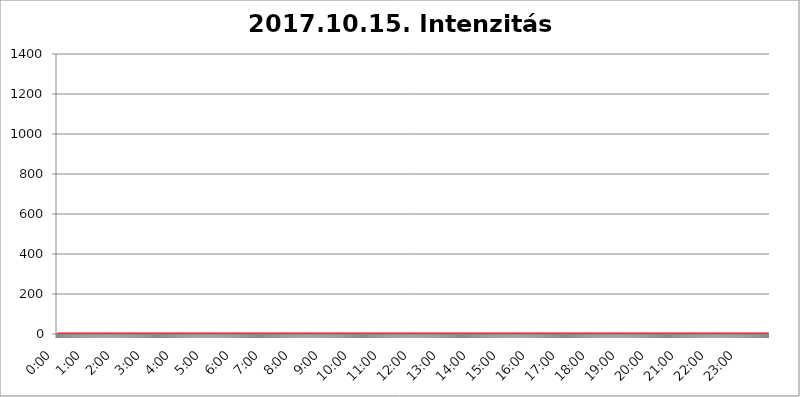
| Category | 2017.10.15. Intenzitás [W/m^2] |
|---|---|
| 0.0 | 0 |
| 0.0006944444444444445 | 0 |
| 0.001388888888888889 | 0 |
| 0.0020833333333333333 | 0 |
| 0.002777777777777778 | 0 |
| 0.003472222222222222 | 0 |
| 0.004166666666666667 | 0 |
| 0.004861111111111111 | 0 |
| 0.005555555555555556 | 0 |
| 0.0062499999999999995 | 0 |
| 0.006944444444444444 | 0 |
| 0.007638888888888889 | 0 |
| 0.008333333333333333 | 0 |
| 0.009027777777777779 | 0 |
| 0.009722222222222222 | 0 |
| 0.010416666666666666 | 0 |
| 0.011111111111111112 | 0 |
| 0.011805555555555555 | 0 |
| 0.012499999999999999 | 0 |
| 0.013194444444444444 | 0 |
| 0.013888888888888888 | 0 |
| 0.014583333333333332 | 0 |
| 0.015277777777777777 | 0 |
| 0.015972222222222224 | 0 |
| 0.016666666666666666 | 0 |
| 0.017361111111111112 | 0 |
| 0.018055555555555557 | 0 |
| 0.01875 | 0 |
| 0.019444444444444445 | 0 |
| 0.02013888888888889 | 0 |
| 0.020833333333333332 | 0 |
| 0.02152777777777778 | 0 |
| 0.022222222222222223 | 0 |
| 0.02291666666666667 | 0 |
| 0.02361111111111111 | 0 |
| 0.024305555555555556 | 0 |
| 0.024999999999999998 | 0 |
| 0.025694444444444447 | 0 |
| 0.02638888888888889 | 0 |
| 0.027083333333333334 | 0 |
| 0.027777777777777776 | 0 |
| 0.02847222222222222 | 0 |
| 0.029166666666666664 | 0 |
| 0.029861111111111113 | 0 |
| 0.030555555555555555 | 0 |
| 0.03125 | 0 |
| 0.03194444444444445 | 0 |
| 0.03263888888888889 | 0 |
| 0.03333333333333333 | 0 |
| 0.034027777777777775 | 0 |
| 0.034722222222222224 | 0 |
| 0.035416666666666666 | 0 |
| 0.036111111111111115 | 0 |
| 0.03680555555555556 | 0 |
| 0.0375 | 0 |
| 0.03819444444444444 | 0 |
| 0.03888888888888889 | 0 |
| 0.03958333333333333 | 0 |
| 0.04027777777777778 | 0 |
| 0.04097222222222222 | 0 |
| 0.041666666666666664 | 0 |
| 0.042361111111111106 | 0 |
| 0.04305555555555556 | 0 |
| 0.043750000000000004 | 0 |
| 0.044444444444444446 | 0 |
| 0.04513888888888889 | 0 |
| 0.04583333333333334 | 0 |
| 0.04652777777777778 | 0 |
| 0.04722222222222222 | 0 |
| 0.04791666666666666 | 0 |
| 0.04861111111111111 | 0 |
| 0.049305555555555554 | 0 |
| 0.049999999999999996 | 0 |
| 0.05069444444444445 | 0 |
| 0.051388888888888894 | 0 |
| 0.052083333333333336 | 0 |
| 0.05277777777777778 | 0 |
| 0.05347222222222222 | 0 |
| 0.05416666666666667 | 0 |
| 0.05486111111111111 | 0 |
| 0.05555555555555555 | 0 |
| 0.05625 | 0 |
| 0.05694444444444444 | 0 |
| 0.057638888888888885 | 0 |
| 0.05833333333333333 | 0 |
| 0.05902777777777778 | 0 |
| 0.059722222222222225 | 0 |
| 0.06041666666666667 | 0 |
| 0.061111111111111116 | 0 |
| 0.06180555555555556 | 0 |
| 0.0625 | 0 |
| 0.06319444444444444 | 0 |
| 0.06388888888888888 | 0 |
| 0.06458333333333334 | 0 |
| 0.06527777777777778 | 0 |
| 0.06597222222222222 | 0 |
| 0.06666666666666667 | 0 |
| 0.06736111111111111 | 0 |
| 0.06805555555555555 | 0 |
| 0.06874999999999999 | 0 |
| 0.06944444444444443 | 0 |
| 0.07013888888888889 | 0 |
| 0.07083333333333333 | 0 |
| 0.07152777777777779 | 0 |
| 0.07222222222222223 | 0 |
| 0.07291666666666667 | 0 |
| 0.07361111111111111 | 0 |
| 0.07430555555555556 | 0 |
| 0.075 | 0 |
| 0.07569444444444444 | 0 |
| 0.0763888888888889 | 0 |
| 0.07708333333333334 | 0 |
| 0.07777777777777778 | 0 |
| 0.07847222222222222 | 0 |
| 0.07916666666666666 | 0 |
| 0.0798611111111111 | 0 |
| 0.08055555555555556 | 0 |
| 0.08125 | 0 |
| 0.08194444444444444 | 0 |
| 0.08263888888888889 | 0 |
| 0.08333333333333333 | 0 |
| 0.08402777777777777 | 0 |
| 0.08472222222222221 | 0 |
| 0.08541666666666665 | 0 |
| 0.08611111111111112 | 0 |
| 0.08680555555555557 | 0 |
| 0.08750000000000001 | 0 |
| 0.08819444444444445 | 0 |
| 0.08888888888888889 | 0 |
| 0.08958333333333333 | 0 |
| 0.09027777777777778 | 0 |
| 0.09097222222222222 | 0 |
| 0.09166666666666667 | 0 |
| 0.09236111111111112 | 0 |
| 0.09305555555555556 | 0 |
| 0.09375 | 0 |
| 0.09444444444444444 | 0 |
| 0.09513888888888888 | 0 |
| 0.09583333333333333 | 0 |
| 0.09652777777777777 | 0 |
| 0.09722222222222222 | 0 |
| 0.09791666666666667 | 0 |
| 0.09861111111111111 | 0 |
| 0.09930555555555555 | 0 |
| 0.09999999999999999 | 0 |
| 0.10069444444444443 | 0 |
| 0.1013888888888889 | 0 |
| 0.10208333333333335 | 0 |
| 0.10277777777777779 | 0 |
| 0.10347222222222223 | 0 |
| 0.10416666666666667 | 0 |
| 0.10486111111111111 | 0 |
| 0.10555555555555556 | 0 |
| 0.10625 | 0 |
| 0.10694444444444444 | 0 |
| 0.1076388888888889 | 0 |
| 0.10833333333333334 | 0 |
| 0.10902777777777778 | 0 |
| 0.10972222222222222 | 0 |
| 0.1111111111111111 | 0 |
| 0.11180555555555556 | 0 |
| 0.11180555555555556 | 0 |
| 0.1125 | 0 |
| 0.11319444444444444 | 0 |
| 0.11388888888888889 | 0 |
| 0.11458333333333333 | 0 |
| 0.11527777777777777 | 0 |
| 0.11597222222222221 | 0 |
| 0.11666666666666665 | 0 |
| 0.1173611111111111 | 0 |
| 0.11805555555555557 | 0 |
| 0.11944444444444445 | 0 |
| 0.12013888888888889 | 0 |
| 0.12083333333333333 | 0 |
| 0.12152777777777778 | 0 |
| 0.12222222222222223 | 0 |
| 0.12291666666666667 | 0 |
| 0.12291666666666667 | 0 |
| 0.12361111111111112 | 0 |
| 0.12430555555555556 | 0 |
| 0.125 | 0 |
| 0.12569444444444444 | 0 |
| 0.12638888888888888 | 0 |
| 0.12708333333333333 | 0 |
| 0.16875 | 0 |
| 0.12847222222222224 | 0 |
| 0.12916666666666668 | 0 |
| 0.12986111111111112 | 0 |
| 0.13055555555555556 | 0 |
| 0.13125 | 0 |
| 0.13194444444444445 | 0 |
| 0.1326388888888889 | 0 |
| 0.13333333333333333 | 0 |
| 0.13402777777777777 | 0 |
| 0.13402777777777777 | 0 |
| 0.13472222222222222 | 0 |
| 0.13541666666666666 | 0 |
| 0.1361111111111111 | 0 |
| 0.13749999999999998 | 0 |
| 0.13819444444444443 | 0 |
| 0.1388888888888889 | 0 |
| 0.13958333333333334 | 0 |
| 0.14027777777777778 | 0 |
| 0.14097222222222222 | 0 |
| 0.14166666666666666 | 0 |
| 0.1423611111111111 | 0 |
| 0.14305555555555557 | 0 |
| 0.14375000000000002 | 0 |
| 0.14444444444444446 | 0 |
| 0.1451388888888889 | 0 |
| 0.1451388888888889 | 0 |
| 0.14652777777777778 | 0 |
| 0.14722222222222223 | 0 |
| 0.14791666666666667 | 0 |
| 0.1486111111111111 | 0 |
| 0.14930555555555555 | 0 |
| 0.15 | 0 |
| 0.15069444444444444 | 0 |
| 0.15138888888888888 | 0 |
| 0.15208333333333332 | 0 |
| 0.15277777777777776 | 0 |
| 0.15347222222222223 | 0 |
| 0.15416666666666667 | 0 |
| 0.15486111111111112 | 0 |
| 0.15555555555555556 | 0 |
| 0.15625 | 0 |
| 0.15694444444444444 | 0 |
| 0.15763888888888888 | 0 |
| 0.15833333333333333 | 0 |
| 0.15902777777777777 | 0 |
| 0.15972222222222224 | 0 |
| 0.16041666666666668 | 0 |
| 0.16111111111111112 | 0 |
| 0.16180555555555556 | 0 |
| 0.1625 | 0 |
| 0.16319444444444445 | 0 |
| 0.1638888888888889 | 0 |
| 0.16458333333333333 | 0 |
| 0.16527777777777777 | 0 |
| 0.16597222222222222 | 0 |
| 0.16666666666666666 | 0 |
| 0.1673611111111111 | 0 |
| 0.16805555555555554 | 0 |
| 0.16874999999999998 | 0 |
| 0.16944444444444443 | 0 |
| 0.17013888888888887 | 0 |
| 0.1708333333333333 | 0 |
| 0.17152777777777775 | 0 |
| 0.17222222222222225 | 0 |
| 0.1729166666666667 | 0 |
| 0.17361111111111113 | 0 |
| 0.17430555555555557 | 0 |
| 0.17500000000000002 | 0 |
| 0.17569444444444446 | 0 |
| 0.1763888888888889 | 0 |
| 0.17708333333333334 | 0 |
| 0.17777777777777778 | 0 |
| 0.17847222222222223 | 0 |
| 0.17916666666666667 | 0 |
| 0.1798611111111111 | 0 |
| 0.18055555555555555 | 0 |
| 0.18125 | 0 |
| 0.18194444444444444 | 0 |
| 0.1826388888888889 | 0 |
| 0.18333333333333335 | 0 |
| 0.1840277777777778 | 0 |
| 0.18472222222222223 | 0 |
| 0.18541666666666667 | 0 |
| 0.18611111111111112 | 0 |
| 0.18680555555555556 | 0 |
| 0.1875 | 0 |
| 0.18819444444444444 | 0 |
| 0.18888888888888888 | 0 |
| 0.18958333333333333 | 0 |
| 0.19027777777777777 | 0 |
| 0.1909722222222222 | 0 |
| 0.19166666666666665 | 0 |
| 0.19236111111111112 | 0 |
| 0.19305555555555554 | 0 |
| 0.19375 | 0 |
| 0.19444444444444445 | 0 |
| 0.1951388888888889 | 0 |
| 0.19583333333333333 | 0 |
| 0.19652777777777777 | 0 |
| 0.19722222222222222 | 0 |
| 0.19791666666666666 | 0 |
| 0.1986111111111111 | 0 |
| 0.19930555555555554 | 0 |
| 0.19999999999999998 | 0 |
| 0.20069444444444443 | 0 |
| 0.20138888888888887 | 0 |
| 0.2020833333333333 | 0 |
| 0.2027777777777778 | 0 |
| 0.2034722222222222 | 0 |
| 0.2041666666666667 | 0 |
| 0.20486111111111113 | 0 |
| 0.20555555555555557 | 0 |
| 0.20625000000000002 | 0 |
| 0.20694444444444446 | 0 |
| 0.2076388888888889 | 0 |
| 0.20833333333333334 | 0 |
| 0.20902777777777778 | 0 |
| 0.20972222222222223 | 0 |
| 0.21041666666666667 | 0 |
| 0.2111111111111111 | 0 |
| 0.21180555555555555 | 0 |
| 0.2125 | 0 |
| 0.21319444444444444 | 0 |
| 0.2138888888888889 | 0 |
| 0.21458333333333335 | 0 |
| 0.2152777777777778 | 0 |
| 0.21597222222222223 | 0 |
| 0.21666666666666667 | 0 |
| 0.21736111111111112 | 0 |
| 0.21805555555555556 | 0 |
| 0.21875 | 0 |
| 0.21944444444444444 | 0 |
| 0.22013888888888888 | 0 |
| 0.22083333333333333 | 0 |
| 0.22152777777777777 | 0 |
| 0.2222222222222222 | 0 |
| 0.22291666666666665 | 0 |
| 0.2236111111111111 | 0 |
| 0.22430555555555556 | 0 |
| 0.225 | 0 |
| 0.22569444444444445 | 0 |
| 0.2263888888888889 | 0 |
| 0.22708333333333333 | 0 |
| 0.22777777777777777 | 0 |
| 0.22847222222222222 | 0 |
| 0.22916666666666666 | 0 |
| 0.2298611111111111 | 0 |
| 0.23055555555555554 | 0 |
| 0.23124999999999998 | 0 |
| 0.23194444444444443 | 0 |
| 0.23263888888888887 | 0 |
| 0.2333333333333333 | 0 |
| 0.2340277777777778 | 0 |
| 0.2347222222222222 | 0 |
| 0.2354166666666667 | 0 |
| 0.23611111111111113 | 0 |
| 0.23680555555555557 | 0 |
| 0.23750000000000002 | 0 |
| 0.23819444444444446 | 0 |
| 0.2388888888888889 | 0 |
| 0.23958333333333334 | 0 |
| 0.24027777777777778 | 0 |
| 0.24097222222222223 | 0 |
| 0.24166666666666667 | 0 |
| 0.2423611111111111 | 0 |
| 0.24305555555555555 | 0 |
| 0.24375 | 0 |
| 0.24444444444444446 | 0 |
| 0.24513888888888888 | 0 |
| 0.24583333333333335 | 0 |
| 0.2465277777777778 | 0 |
| 0.24722222222222223 | 0 |
| 0.24791666666666667 | 0 |
| 0.24861111111111112 | 0 |
| 0.24930555555555556 | 0 |
| 0.25 | 0 |
| 0.25069444444444444 | 0 |
| 0.2513888888888889 | 0 |
| 0.2520833333333333 | 0 |
| 0.25277777777777777 | 0 |
| 0.2534722222222222 | 0 |
| 0.25416666666666665 | 0 |
| 0.2548611111111111 | 0 |
| 0.2555555555555556 | 0 |
| 0.25625000000000003 | 0 |
| 0.2569444444444445 | 0 |
| 0.2576388888888889 | 0 |
| 0.25833333333333336 | 0 |
| 0.2590277777777778 | 0 |
| 0.25972222222222224 | 0 |
| 0.2604166666666667 | 0 |
| 0.2611111111111111 | 0 |
| 0.26180555555555557 | 0 |
| 0.2625 | 0 |
| 0.26319444444444445 | 0 |
| 0.2638888888888889 | 0 |
| 0.26458333333333334 | 0 |
| 0.2652777777777778 | 0 |
| 0.2659722222222222 | 0 |
| 0.26666666666666666 | 0 |
| 0.2673611111111111 | 0 |
| 0.26805555555555555 | 0 |
| 0.26875 | 0 |
| 0.26944444444444443 | 0 |
| 0.2701388888888889 | 0 |
| 0.2708333333333333 | 0 |
| 0.27152777777777776 | 0 |
| 0.2722222222222222 | 0 |
| 0.27291666666666664 | 0 |
| 0.2736111111111111 | 0 |
| 0.2743055555555555 | 0 |
| 0.27499999999999997 | 0 |
| 0.27569444444444446 | 0 |
| 0.27638888888888885 | 0 |
| 0.27708333333333335 | 0 |
| 0.2777777777777778 | 0 |
| 0.27847222222222223 | 0 |
| 0.2791666666666667 | 0 |
| 0.2798611111111111 | 0 |
| 0.28055555555555556 | 0 |
| 0.28125 | 0 |
| 0.28194444444444444 | 0 |
| 0.2826388888888889 | 0 |
| 0.2833333333333333 | 0 |
| 0.28402777777777777 | 0 |
| 0.2847222222222222 | 0 |
| 0.28541666666666665 | 0 |
| 0.28611111111111115 | 0 |
| 0.28680555555555554 | 0 |
| 0.28750000000000003 | 0 |
| 0.2881944444444445 | 0 |
| 0.2888888888888889 | 0 |
| 0.28958333333333336 | 0 |
| 0.2902777777777778 | 0 |
| 0.29097222222222224 | 0 |
| 0.2916666666666667 | 0 |
| 0.2923611111111111 | 0 |
| 0.29305555555555557 | 0 |
| 0.29375 | 0 |
| 0.29444444444444445 | 0 |
| 0.2951388888888889 | 0 |
| 0.29583333333333334 | 0 |
| 0.2965277777777778 | 0 |
| 0.2972222222222222 | 0 |
| 0.29791666666666666 | 0 |
| 0.2986111111111111 | 0 |
| 0.29930555555555555 | 0 |
| 0.3 | 0 |
| 0.30069444444444443 | 0 |
| 0.3013888888888889 | 0 |
| 0.3020833333333333 | 0 |
| 0.30277777777777776 | 0 |
| 0.3034722222222222 | 0 |
| 0.30416666666666664 | 0 |
| 0.3048611111111111 | 0 |
| 0.3055555555555555 | 0 |
| 0.30624999999999997 | 0 |
| 0.3069444444444444 | 0 |
| 0.3076388888888889 | 0 |
| 0.30833333333333335 | 0 |
| 0.3090277777777778 | 0 |
| 0.30972222222222223 | 0 |
| 0.3104166666666667 | 0 |
| 0.3111111111111111 | 0 |
| 0.31180555555555556 | 0 |
| 0.3125 | 0 |
| 0.31319444444444444 | 0 |
| 0.3138888888888889 | 0 |
| 0.3145833333333333 | 0 |
| 0.31527777777777777 | 0 |
| 0.3159722222222222 | 0 |
| 0.31666666666666665 | 0 |
| 0.31736111111111115 | 0 |
| 0.31805555555555554 | 0 |
| 0.31875000000000003 | 0 |
| 0.3194444444444445 | 0 |
| 0.3201388888888889 | 0 |
| 0.32083333333333336 | 0 |
| 0.3215277777777778 | 0 |
| 0.32222222222222224 | 0 |
| 0.3229166666666667 | 0 |
| 0.3236111111111111 | 0 |
| 0.32430555555555557 | 0 |
| 0.325 | 0 |
| 0.32569444444444445 | 0 |
| 0.3263888888888889 | 0 |
| 0.32708333333333334 | 0 |
| 0.3277777777777778 | 0 |
| 0.3284722222222222 | 0 |
| 0.32916666666666666 | 0 |
| 0.3298611111111111 | 0 |
| 0.33055555555555555 | 0 |
| 0.33125 | 0 |
| 0.33194444444444443 | 0 |
| 0.3326388888888889 | 0 |
| 0.3333333333333333 | 0 |
| 0.3340277777777778 | 0 |
| 0.3347222222222222 | 0 |
| 0.3354166666666667 | 0 |
| 0.3361111111111111 | 0 |
| 0.3368055555555556 | 0 |
| 0.33749999999999997 | 0 |
| 0.33819444444444446 | 0 |
| 0.33888888888888885 | 0 |
| 0.33958333333333335 | 0 |
| 0.34027777777777773 | 0 |
| 0.34097222222222223 | 0 |
| 0.3416666666666666 | 0 |
| 0.3423611111111111 | 0 |
| 0.3430555555555555 | 0 |
| 0.34375 | 0 |
| 0.3444444444444445 | 0 |
| 0.3451388888888889 | 0 |
| 0.3458333333333334 | 0 |
| 0.34652777777777777 | 0 |
| 0.34722222222222227 | 0 |
| 0.34791666666666665 | 0 |
| 0.34861111111111115 | 0 |
| 0.34930555555555554 | 0 |
| 0.35000000000000003 | 0 |
| 0.3506944444444444 | 0 |
| 0.3513888888888889 | 0 |
| 0.3520833333333333 | 0 |
| 0.3527777777777778 | 0 |
| 0.3534722222222222 | 0 |
| 0.3541666666666667 | 0 |
| 0.3548611111111111 | 0 |
| 0.35555555555555557 | 0 |
| 0.35625 | 0 |
| 0.35694444444444445 | 0 |
| 0.3576388888888889 | 0 |
| 0.35833333333333334 | 0 |
| 0.3590277777777778 | 0 |
| 0.3597222222222222 | 0 |
| 0.36041666666666666 | 0 |
| 0.3611111111111111 | 0 |
| 0.36180555555555555 | 0 |
| 0.3625 | 0 |
| 0.36319444444444443 | 0 |
| 0.3638888888888889 | 0 |
| 0.3645833333333333 | 0 |
| 0.3652777777777778 | 0 |
| 0.3659722222222222 | 0 |
| 0.3666666666666667 | 0 |
| 0.3673611111111111 | 0 |
| 0.3680555555555556 | 0 |
| 0.36874999999999997 | 0 |
| 0.36944444444444446 | 0 |
| 0.37013888888888885 | 0 |
| 0.37083333333333335 | 0 |
| 0.37152777777777773 | 0 |
| 0.37222222222222223 | 0 |
| 0.3729166666666666 | 0 |
| 0.3736111111111111 | 0 |
| 0.3743055555555555 | 0 |
| 0.375 | 0 |
| 0.3756944444444445 | 0 |
| 0.3763888888888889 | 0 |
| 0.3770833333333334 | 0 |
| 0.37777777777777777 | 0 |
| 0.37847222222222227 | 0 |
| 0.37916666666666665 | 0 |
| 0.37986111111111115 | 0 |
| 0.38055555555555554 | 0 |
| 0.38125000000000003 | 0 |
| 0.3819444444444444 | 0 |
| 0.3826388888888889 | 0 |
| 0.3833333333333333 | 0 |
| 0.3840277777777778 | 0 |
| 0.3847222222222222 | 0 |
| 0.3854166666666667 | 0 |
| 0.3861111111111111 | 0 |
| 0.38680555555555557 | 0 |
| 0.3875 | 0 |
| 0.38819444444444445 | 0 |
| 0.3888888888888889 | 0 |
| 0.38958333333333334 | 0 |
| 0.3902777777777778 | 0 |
| 0.3909722222222222 | 0 |
| 0.39166666666666666 | 0 |
| 0.3923611111111111 | 0 |
| 0.39305555555555555 | 0 |
| 0.39375 | 0 |
| 0.39444444444444443 | 0 |
| 0.3951388888888889 | 0 |
| 0.3958333333333333 | 0 |
| 0.3965277777777778 | 0 |
| 0.3972222222222222 | 0 |
| 0.3979166666666667 | 0 |
| 0.3986111111111111 | 0 |
| 0.3993055555555556 | 0 |
| 0.39999999999999997 | 0 |
| 0.40069444444444446 | 0 |
| 0.40138888888888885 | 0 |
| 0.40208333333333335 | 0 |
| 0.40277777777777773 | 0 |
| 0.40347222222222223 | 0 |
| 0.4041666666666666 | 0 |
| 0.4048611111111111 | 0 |
| 0.4055555555555555 | 0 |
| 0.40625 | 0 |
| 0.4069444444444445 | 0 |
| 0.4076388888888889 | 0 |
| 0.4083333333333334 | 0 |
| 0.40902777777777777 | 0 |
| 0.40972222222222227 | 0 |
| 0.41041666666666665 | 0 |
| 0.41111111111111115 | 0 |
| 0.41180555555555554 | 0 |
| 0.41250000000000003 | 0 |
| 0.4131944444444444 | 0 |
| 0.4138888888888889 | 0 |
| 0.4145833333333333 | 0 |
| 0.4152777777777778 | 0 |
| 0.4159722222222222 | 0 |
| 0.4166666666666667 | 0 |
| 0.4173611111111111 | 0 |
| 0.41805555555555557 | 0 |
| 0.41875 | 0 |
| 0.41944444444444445 | 0 |
| 0.4201388888888889 | 0 |
| 0.42083333333333334 | 0 |
| 0.4215277777777778 | 0 |
| 0.4222222222222222 | 0 |
| 0.42291666666666666 | 0 |
| 0.4236111111111111 | 0 |
| 0.42430555555555555 | 0 |
| 0.425 | 0 |
| 0.42569444444444443 | 0 |
| 0.4263888888888889 | 0 |
| 0.4270833333333333 | 0 |
| 0.4277777777777778 | 0 |
| 0.4284722222222222 | 0 |
| 0.4291666666666667 | 0 |
| 0.4298611111111111 | 0 |
| 0.4305555555555556 | 0 |
| 0.43124999999999997 | 0 |
| 0.43194444444444446 | 0 |
| 0.43263888888888885 | 0 |
| 0.43333333333333335 | 0 |
| 0.43402777777777773 | 0 |
| 0.43472222222222223 | 0 |
| 0.4354166666666666 | 0 |
| 0.4361111111111111 | 0 |
| 0.4368055555555555 | 0 |
| 0.4375 | 0 |
| 0.4381944444444445 | 0 |
| 0.4388888888888889 | 0 |
| 0.4395833333333334 | 0 |
| 0.44027777777777777 | 0 |
| 0.44097222222222227 | 0 |
| 0.44166666666666665 | 0 |
| 0.44236111111111115 | 0 |
| 0.44305555555555554 | 0 |
| 0.44375000000000003 | 0 |
| 0.4444444444444444 | 0 |
| 0.4451388888888889 | 0 |
| 0.4458333333333333 | 0 |
| 0.4465277777777778 | 0 |
| 0.4472222222222222 | 0 |
| 0.4479166666666667 | 0 |
| 0.4486111111111111 | 0 |
| 0.44930555555555557 | 0 |
| 0.45 | 0 |
| 0.45069444444444445 | 0 |
| 0.4513888888888889 | 0 |
| 0.45208333333333334 | 0 |
| 0.4527777777777778 | 0 |
| 0.4534722222222222 | 0 |
| 0.45416666666666666 | 0 |
| 0.4548611111111111 | 0 |
| 0.45555555555555555 | 0 |
| 0.45625 | 0 |
| 0.45694444444444443 | 0 |
| 0.4576388888888889 | 0 |
| 0.4583333333333333 | 0 |
| 0.4590277777777778 | 0 |
| 0.4597222222222222 | 0 |
| 0.4604166666666667 | 0 |
| 0.4611111111111111 | 0 |
| 0.4618055555555556 | 0 |
| 0.46249999999999997 | 0 |
| 0.46319444444444446 | 0 |
| 0.46388888888888885 | 0 |
| 0.46458333333333335 | 0 |
| 0.46527777777777773 | 0 |
| 0.46597222222222223 | 0 |
| 0.4666666666666666 | 0 |
| 0.4673611111111111 | 0 |
| 0.4680555555555555 | 0 |
| 0.46875 | 0 |
| 0.4694444444444445 | 0 |
| 0.4701388888888889 | 0 |
| 0.4708333333333334 | 0 |
| 0.47152777777777777 | 0 |
| 0.47222222222222227 | 0 |
| 0.47291666666666665 | 0 |
| 0.47361111111111115 | 0 |
| 0.47430555555555554 | 0 |
| 0.47500000000000003 | 0 |
| 0.4756944444444444 | 0 |
| 0.4763888888888889 | 0 |
| 0.4770833333333333 | 0 |
| 0.4777777777777778 | 0 |
| 0.4784722222222222 | 0 |
| 0.4791666666666667 | 0 |
| 0.4798611111111111 | 0 |
| 0.48055555555555557 | 0 |
| 0.48125 | 0 |
| 0.48194444444444445 | 0 |
| 0.4826388888888889 | 0 |
| 0.48333333333333334 | 0 |
| 0.4840277777777778 | 0 |
| 0.4847222222222222 | 0 |
| 0.48541666666666666 | 0 |
| 0.4861111111111111 | 0 |
| 0.48680555555555555 | 0 |
| 0.4875 | 0 |
| 0.48819444444444443 | 0 |
| 0.4888888888888889 | 0 |
| 0.4895833333333333 | 0 |
| 0.4902777777777778 | 0 |
| 0.4909722222222222 | 0 |
| 0.4916666666666667 | 0 |
| 0.4923611111111111 | 0 |
| 0.4930555555555556 | 0 |
| 0.49374999999999997 | 0 |
| 0.49444444444444446 | 0 |
| 0.49513888888888885 | 0 |
| 0.49583333333333335 | 0 |
| 0.49652777777777773 | 0 |
| 0.49722222222222223 | 0 |
| 0.4979166666666666 | 0 |
| 0.4986111111111111 | 0 |
| 0.4993055555555555 | 0 |
| 0.5 | 0 |
| 0.5006944444444444 | 0 |
| 0.5013888888888889 | 0 |
| 0.5020833333333333 | 0 |
| 0.5027777777777778 | 0 |
| 0.5034722222222222 | 0 |
| 0.5041666666666667 | 0 |
| 0.5048611111111111 | 0 |
| 0.5055555555555555 | 0 |
| 0.50625 | 0 |
| 0.5069444444444444 | 0 |
| 0.5076388888888889 | 0 |
| 0.5083333333333333 | 0 |
| 0.5090277777777777 | 0 |
| 0.5097222222222222 | 0 |
| 0.5104166666666666 | 0 |
| 0.5111111111111112 | 0 |
| 0.5118055555555555 | 0 |
| 0.5125000000000001 | 0 |
| 0.5131944444444444 | 0 |
| 0.513888888888889 | 0 |
| 0.5145833333333333 | 0 |
| 0.5152777777777778 | 0 |
| 0.5159722222222222 | 0 |
| 0.5166666666666667 | 0 |
| 0.517361111111111 | 0 |
| 0.5180555555555556 | 0 |
| 0.5187499999999999 | 0 |
| 0.5194444444444445 | 0 |
| 0.5201388888888888 | 0 |
| 0.5208333333333334 | 0 |
| 0.5215277777777778 | 0 |
| 0.5222222222222223 | 0 |
| 0.5229166666666667 | 0 |
| 0.5236111111111111 | 0 |
| 0.5243055555555556 | 0 |
| 0.525 | 0 |
| 0.5256944444444445 | 0 |
| 0.5263888888888889 | 0 |
| 0.5270833333333333 | 0 |
| 0.5277777777777778 | 0 |
| 0.5284722222222222 | 0 |
| 0.5291666666666667 | 0 |
| 0.5298611111111111 | 0 |
| 0.5305555555555556 | 0 |
| 0.53125 | 0 |
| 0.5319444444444444 | 0 |
| 0.5326388888888889 | 0 |
| 0.5333333333333333 | 0 |
| 0.5340277777777778 | 0 |
| 0.5347222222222222 | 0 |
| 0.5354166666666667 | 0 |
| 0.5361111111111111 | 0 |
| 0.5368055555555555 | 0 |
| 0.5375 | 0 |
| 0.5381944444444444 | 0 |
| 0.5388888888888889 | 0 |
| 0.5395833333333333 | 0 |
| 0.5402777777777777 | 0 |
| 0.5409722222222222 | 0 |
| 0.5416666666666666 | 0 |
| 0.5423611111111112 | 0 |
| 0.5430555555555555 | 0 |
| 0.5437500000000001 | 0 |
| 0.5444444444444444 | 0 |
| 0.545138888888889 | 0 |
| 0.5458333333333333 | 0 |
| 0.5465277777777778 | 0 |
| 0.5472222222222222 | 0 |
| 0.5479166666666667 | 0 |
| 0.548611111111111 | 0 |
| 0.5493055555555556 | 0 |
| 0.5499999999999999 | 0 |
| 0.5506944444444445 | 0 |
| 0.5513888888888888 | 0 |
| 0.5520833333333334 | 0 |
| 0.5527777777777778 | 0 |
| 0.5534722222222223 | 0 |
| 0.5541666666666667 | 0 |
| 0.5548611111111111 | 0 |
| 0.5555555555555556 | 0 |
| 0.55625 | 0 |
| 0.5569444444444445 | 0 |
| 0.5576388888888889 | 0 |
| 0.5583333333333333 | 0 |
| 0.5590277777777778 | 0 |
| 0.5597222222222222 | 0 |
| 0.5604166666666667 | 0 |
| 0.5611111111111111 | 0 |
| 0.5618055555555556 | 0 |
| 0.5625 | 0 |
| 0.5631944444444444 | 0 |
| 0.5638888888888889 | 0 |
| 0.5645833333333333 | 0 |
| 0.5652777777777778 | 0 |
| 0.5659722222222222 | 0 |
| 0.5666666666666667 | 0 |
| 0.5673611111111111 | 0 |
| 0.5680555555555555 | 0 |
| 0.56875 | 0 |
| 0.5694444444444444 | 0 |
| 0.5701388888888889 | 0 |
| 0.5708333333333333 | 0 |
| 0.5715277777777777 | 0 |
| 0.5722222222222222 | 0 |
| 0.5729166666666666 | 0 |
| 0.5736111111111112 | 0 |
| 0.5743055555555555 | 0 |
| 0.5750000000000001 | 0 |
| 0.5756944444444444 | 0 |
| 0.576388888888889 | 0 |
| 0.5770833333333333 | 0 |
| 0.5777777777777778 | 0 |
| 0.5784722222222222 | 0 |
| 0.5791666666666667 | 0 |
| 0.579861111111111 | 0 |
| 0.5805555555555556 | 0 |
| 0.5812499999999999 | 0 |
| 0.5819444444444445 | 0 |
| 0.5826388888888888 | 0 |
| 0.5833333333333334 | 0 |
| 0.5840277777777778 | 0 |
| 0.5847222222222223 | 0 |
| 0.5854166666666667 | 0 |
| 0.5861111111111111 | 0 |
| 0.5868055555555556 | 0 |
| 0.5875 | 0 |
| 0.5881944444444445 | 0 |
| 0.5888888888888889 | 0 |
| 0.5895833333333333 | 0 |
| 0.5902777777777778 | 0 |
| 0.5909722222222222 | 0 |
| 0.5916666666666667 | 0 |
| 0.5923611111111111 | 0 |
| 0.5930555555555556 | 0 |
| 0.59375 | 0 |
| 0.5944444444444444 | 0 |
| 0.5951388888888889 | 0 |
| 0.5958333333333333 | 0 |
| 0.5965277777777778 | 0 |
| 0.5972222222222222 | 0 |
| 0.5979166666666667 | 0 |
| 0.5986111111111111 | 0 |
| 0.5993055555555555 | 0 |
| 0.6 | 0 |
| 0.6006944444444444 | 0 |
| 0.6013888888888889 | 0 |
| 0.6020833333333333 | 0 |
| 0.6027777777777777 | 0 |
| 0.6034722222222222 | 0 |
| 0.6041666666666666 | 0 |
| 0.6048611111111112 | 0 |
| 0.6055555555555555 | 0 |
| 0.6062500000000001 | 0 |
| 0.6069444444444444 | 0 |
| 0.607638888888889 | 0 |
| 0.6083333333333333 | 0 |
| 0.6090277777777778 | 0 |
| 0.6097222222222222 | 0 |
| 0.6104166666666667 | 0 |
| 0.611111111111111 | 0 |
| 0.6118055555555556 | 0 |
| 0.6124999999999999 | 0 |
| 0.6131944444444445 | 0 |
| 0.6138888888888888 | 0 |
| 0.6145833333333334 | 0 |
| 0.6152777777777778 | 0 |
| 0.6159722222222223 | 0 |
| 0.6166666666666667 | 0 |
| 0.6173611111111111 | 0 |
| 0.6180555555555556 | 0 |
| 0.61875 | 0 |
| 0.6194444444444445 | 0 |
| 0.6201388888888889 | 0 |
| 0.6208333333333333 | 0 |
| 0.6215277777777778 | 0 |
| 0.6222222222222222 | 0 |
| 0.6229166666666667 | 0 |
| 0.6236111111111111 | 0 |
| 0.6243055555555556 | 0 |
| 0.625 | 0 |
| 0.6256944444444444 | 0 |
| 0.6263888888888889 | 0 |
| 0.6270833333333333 | 0 |
| 0.6277777777777778 | 0 |
| 0.6284722222222222 | 0 |
| 0.6291666666666667 | 0 |
| 0.6298611111111111 | 0 |
| 0.6305555555555555 | 0 |
| 0.63125 | 0 |
| 0.6319444444444444 | 0 |
| 0.6326388888888889 | 0 |
| 0.6333333333333333 | 0 |
| 0.6340277777777777 | 0 |
| 0.6347222222222222 | 0 |
| 0.6354166666666666 | 0 |
| 0.6361111111111112 | 0 |
| 0.6368055555555555 | 0 |
| 0.6375000000000001 | 0 |
| 0.6381944444444444 | 0 |
| 0.638888888888889 | 0 |
| 0.6395833333333333 | 0 |
| 0.6402777777777778 | 0 |
| 0.6409722222222222 | 0 |
| 0.6416666666666667 | 0 |
| 0.642361111111111 | 0 |
| 0.6430555555555556 | 0 |
| 0.6437499999999999 | 0 |
| 0.6444444444444445 | 0 |
| 0.6451388888888888 | 0 |
| 0.6458333333333334 | 0 |
| 0.6465277777777778 | 0 |
| 0.6472222222222223 | 0 |
| 0.6479166666666667 | 0 |
| 0.6486111111111111 | 0 |
| 0.6493055555555556 | 0 |
| 0.65 | 0 |
| 0.6506944444444445 | 0 |
| 0.6513888888888889 | 0 |
| 0.6520833333333333 | 0 |
| 0.6527777777777778 | 0 |
| 0.6534722222222222 | 0 |
| 0.6541666666666667 | 0 |
| 0.6548611111111111 | 0 |
| 0.6555555555555556 | 0 |
| 0.65625 | 0 |
| 0.6569444444444444 | 0 |
| 0.6576388888888889 | 0 |
| 0.6583333333333333 | 0 |
| 0.6590277777777778 | 0 |
| 0.6597222222222222 | 0 |
| 0.6604166666666667 | 0 |
| 0.6611111111111111 | 0 |
| 0.6618055555555555 | 0 |
| 0.6625 | 0 |
| 0.6631944444444444 | 0 |
| 0.6638888888888889 | 0 |
| 0.6645833333333333 | 0 |
| 0.6652777777777777 | 0 |
| 0.6659722222222222 | 0 |
| 0.6666666666666666 | 0 |
| 0.6673611111111111 | 0 |
| 0.6680555555555556 | 0 |
| 0.6687500000000001 | 0 |
| 0.6694444444444444 | 0 |
| 0.6701388888888888 | 0 |
| 0.6708333333333334 | 0 |
| 0.6715277777777778 | 0 |
| 0.6722222222222222 | 0 |
| 0.6729166666666666 | 0 |
| 0.6736111111111112 | 0 |
| 0.6743055555555556 | 0 |
| 0.6749999999999999 | 0 |
| 0.6756944444444444 | 0 |
| 0.6763888888888889 | 0 |
| 0.6770833333333334 | 0 |
| 0.6777777777777777 | 0 |
| 0.6784722222222223 | 0 |
| 0.6791666666666667 | 0 |
| 0.6798611111111111 | 0 |
| 0.6805555555555555 | 0 |
| 0.68125 | 0 |
| 0.6819444444444445 | 0 |
| 0.6826388888888889 | 0 |
| 0.6833333333333332 | 0 |
| 0.6840277777777778 | 0 |
| 0.6847222222222222 | 0 |
| 0.6854166666666667 | 0 |
| 0.686111111111111 | 0 |
| 0.6868055555555556 | 0 |
| 0.6875 | 0 |
| 0.6881944444444444 | 0 |
| 0.688888888888889 | 0 |
| 0.6895833333333333 | 0 |
| 0.6902777777777778 | 0 |
| 0.6909722222222222 | 0 |
| 0.6916666666666668 | 0 |
| 0.6923611111111111 | 0 |
| 0.6930555555555555 | 0 |
| 0.69375 | 0 |
| 0.6944444444444445 | 0 |
| 0.6951388888888889 | 0 |
| 0.6958333333333333 | 0 |
| 0.6965277777777777 | 0 |
| 0.6972222222222223 | 0 |
| 0.6979166666666666 | 0 |
| 0.6986111111111111 | 0 |
| 0.6993055555555556 | 0 |
| 0.7000000000000001 | 0 |
| 0.7006944444444444 | 0 |
| 0.7013888888888888 | 0 |
| 0.7020833333333334 | 0 |
| 0.7027777777777778 | 0 |
| 0.7034722222222222 | 0 |
| 0.7041666666666666 | 0 |
| 0.7048611111111112 | 0 |
| 0.7055555555555556 | 0 |
| 0.7062499999999999 | 0 |
| 0.7069444444444444 | 0 |
| 0.7076388888888889 | 0 |
| 0.7083333333333334 | 0 |
| 0.7090277777777777 | 0 |
| 0.7097222222222223 | 0 |
| 0.7104166666666667 | 0 |
| 0.7111111111111111 | 0 |
| 0.7118055555555555 | 0 |
| 0.7125 | 0 |
| 0.7131944444444445 | 0 |
| 0.7138888888888889 | 0 |
| 0.7145833333333332 | 0 |
| 0.7152777777777778 | 0 |
| 0.7159722222222222 | 0 |
| 0.7166666666666667 | 0 |
| 0.717361111111111 | 0 |
| 0.7180555555555556 | 0 |
| 0.71875 | 0 |
| 0.7194444444444444 | 0 |
| 0.720138888888889 | 0 |
| 0.7208333333333333 | 0 |
| 0.7215277777777778 | 0 |
| 0.7222222222222222 | 0 |
| 0.7229166666666668 | 0 |
| 0.7236111111111111 | 0 |
| 0.7243055555555555 | 0 |
| 0.725 | 0 |
| 0.7256944444444445 | 0 |
| 0.7263888888888889 | 0 |
| 0.7270833333333333 | 0 |
| 0.7277777777777777 | 0 |
| 0.7284722222222223 | 0 |
| 0.7291666666666666 | 0 |
| 0.7298611111111111 | 0 |
| 0.7305555555555556 | 0 |
| 0.7312500000000001 | 0 |
| 0.7319444444444444 | 0 |
| 0.7326388888888888 | 0 |
| 0.7333333333333334 | 0 |
| 0.7340277777777778 | 0 |
| 0.7347222222222222 | 0 |
| 0.7354166666666666 | 0 |
| 0.7361111111111112 | 0 |
| 0.7368055555555556 | 0 |
| 0.7374999999999999 | 0 |
| 0.7381944444444444 | 0 |
| 0.7388888888888889 | 0 |
| 0.7395833333333334 | 0 |
| 0.7402777777777777 | 0 |
| 0.7409722222222223 | 0 |
| 0.7416666666666667 | 0 |
| 0.7423611111111111 | 0 |
| 0.7430555555555555 | 0 |
| 0.74375 | 0 |
| 0.7444444444444445 | 0 |
| 0.7451388888888889 | 0 |
| 0.7458333333333332 | 0 |
| 0.7465277777777778 | 0 |
| 0.7472222222222222 | 0 |
| 0.7479166666666667 | 0 |
| 0.748611111111111 | 0 |
| 0.7493055555555556 | 0 |
| 0.75 | 0 |
| 0.7506944444444444 | 0 |
| 0.751388888888889 | 0 |
| 0.7520833333333333 | 0 |
| 0.7527777777777778 | 0 |
| 0.7534722222222222 | 0 |
| 0.7541666666666668 | 0 |
| 0.7548611111111111 | 0 |
| 0.7555555555555555 | 0 |
| 0.75625 | 0 |
| 0.7569444444444445 | 0 |
| 0.7576388888888889 | 0 |
| 0.7583333333333333 | 0 |
| 0.7590277777777777 | 0 |
| 0.7597222222222223 | 0 |
| 0.7604166666666666 | 0 |
| 0.7611111111111111 | 0 |
| 0.7618055555555556 | 0 |
| 0.7625000000000001 | 0 |
| 0.7631944444444444 | 0 |
| 0.7638888888888888 | 0 |
| 0.7645833333333334 | 0 |
| 0.7652777777777778 | 0 |
| 0.7659722222222222 | 0 |
| 0.7666666666666666 | 0 |
| 0.7673611111111112 | 0 |
| 0.7680555555555556 | 0 |
| 0.7687499999999999 | 0 |
| 0.7694444444444444 | 0 |
| 0.7701388888888889 | 0 |
| 0.7708333333333334 | 0 |
| 0.7715277777777777 | 0 |
| 0.7722222222222223 | 0 |
| 0.7729166666666667 | 0 |
| 0.7736111111111111 | 0 |
| 0.7743055555555555 | 0 |
| 0.775 | 0 |
| 0.7756944444444445 | 0 |
| 0.7763888888888889 | 0 |
| 0.7770833333333332 | 0 |
| 0.7777777777777778 | 0 |
| 0.7784722222222222 | 0 |
| 0.7791666666666667 | 0 |
| 0.779861111111111 | 0 |
| 0.7805555555555556 | 0 |
| 0.78125 | 0 |
| 0.7819444444444444 | 0 |
| 0.782638888888889 | 0 |
| 0.7833333333333333 | 0 |
| 0.7840277777777778 | 0 |
| 0.7847222222222222 | 0 |
| 0.7854166666666668 | 0 |
| 0.7861111111111111 | 0 |
| 0.7868055555555555 | 0 |
| 0.7875 | 0 |
| 0.7881944444444445 | 0 |
| 0.7888888888888889 | 0 |
| 0.7895833333333333 | 0 |
| 0.7902777777777777 | 0 |
| 0.7909722222222223 | 0 |
| 0.7916666666666666 | 0 |
| 0.7923611111111111 | 0 |
| 0.7930555555555556 | 0 |
| 0.7937500000000001 | 0 |
| 0.7944444444444444 | 0 |
| 0.7951388888888888 | 0 |
| 0.7958333333333334 | 0 |
| 0.7965277777777778 | 0 |
| 0.7972222222222222 | 0 |
| 0.7979166666666666 | 0 |
| 0.7986111111111112 | 0 |
| 0.7993055555555556 | 0 |
| 0.7999999999999999 | 0 |
| 0.8006944444444444 | 0 |
| 0.8013888888888889 | 0 |
| 0.8020833333333334 | 0 |
| 0.8027777777777777 | 0 |
| 0.8034722222222223 | 0 |
| 0.8041666666666667 | 0 |
| 0.8048611111111111 | 0 |
| 0.8055555555555555 | 0 |
| 0.80625 | 0 |
| 0.8069444444444445 | 0 |
| 0.8076388888888889 | 0 |
| 0.8083333333333332 | 0 |
| 0.8090277777777778 | 0 |
| 0.8097222222222222 | 0 |
| 0.8104166666666667 | 0 |
| 0.811111111111111 | 0 |
| 0.8118055555555556 | 0 |
| 0.8125 | 0 |
| 0.8131944444444444 | 0 |
| 0.813888888888889 | 0 |
| 0.8145833333333333 | 0 |
| 0.8152777777777778 | 0 |
| 0.8159722222222222 | 0 |
| 0.8166666666666668 | 0 |
| 0.8173611111111111 | 0 |
| 0.8180555555555555 | 0 |
| 0.81875 | 0 |
| 0.8194444444444445 | 0 |
| 0.8201388888888889 | 0 |
| 0.8208333333333333 | 0 |
| 0.8215277777777777 | 0 |
| 0.8222222222222223 | 0 |
| 0.8229166666666666 | 0 |
| 0.8236111111111111 | 0 |
| 0.8243055555555556 | 0 |
| 0.8250000000000001 | 0 |
| 0.8256944444444444 | 0 |
| 0.8263888888888888 | 0 |
| 0.8270833333333334 | 0 |
| 0.8277777777777778 | 0 |
| 0.8284722222222222 | 0 |
| 0.8291666666666666 | 0 |
| 0.8298611111111112 | 0 |
| 0.8305555555555556 | 0 |
| 0.8312499999999999 | 0 |
| 0.8319444444444444 | 0 |
| 0.8326388888888889 | 0 |
| 0.8333333333333334 | 0 |
| 0.8340277777777777 | 0 |
| 0.8347222222222223 | 0 |
| 0.8354166666666667 | 0 |
| 0.8361111111111111 | 0 |
| 0.8368055555555555 | 0 |
| 0.8375 | 0 |
| 0.8381944444444445 | 0 |
| 0.8388888888888889 | 0 |
| 0.8395833333333332 | 0 |
| 0.8402777777777778 | 0 |
| 0.8409722222222222 | 0 |
| 0.8416666666666667 | 0 |
| 0.842361111111111 | 0 |
| 0.8430555555555556 | 0 |
| 0.84375 | 0 |
| 0.8444444444444444 | 0 |
| 0.845138888888889 | 0 |
| 0.8458333333333333 | 0 |
| 0.8465277777777778 | 0 |
| 0.8472222222222222 | 0 |
| 0.8479166666666668 | 0 |
| 0.8486111111111111 | 0 |
| 0.8493055555555555 | 0 |
| 0.85 | 0 |
| 0.8506944444444445 | 0 |
| 0.8513888888888889 | 0 |
| 0.8520833333333333 | 0 |
| 0.8527777777777777 | 0 |
| 0.8534722222222223 | 0 |
| 0.8541666666666666 | 0 |
| 0.8548611111111111 | 0 |
| 0.8555555555555556 | 0 |
| 0.8562500000000001 | 0 |
| 0.8569444444444444 | 0 |
| 0.8576388888888888 | 0 |
| 0.8583333333333334 | 0 |
| 0.8590277777777778 | 0 |
| 0.8597222222222222 | 0 |
| 0.8604166666666666 | 0 |
| 0.8611111111111112 | 0 |
| 0.8618055555555556 | 0 |
| 0.8624999999999999 | 0 |
| 0.8631944444444444 | 0 |
| 0.8638888888888889 | 0 |
| 0.8645833333333334 | 0 |
| 0.8652777777777777 | 0 |
| 0.8659722222222223 | 0 |
| 0.8666666666666667 | 0 |
| 0.8673611111111111 | 0 |
| 0.8680555555555555 | 0 |
| 0.86875 | 0 |
| 0.8694444444444445 | 0 |
| 0.8701388888888889 | 0 |
| 0.8708333333333332 | 0 |
| 0.8715277777777778 | 0 |
| 0.8722222222222222 | 0 |
| 0.8729166666666667 | 0 |
| 0.873611111111111 | 0 |
| 0.8743055555555556 | 0 |
| 0.875 | 0 |
| 0.8756944444444444 | 0 |
| 0.876388888888889 | 0 |
| 0.8770833333333333 | 0 |
| 0.8777777777777778 | 0 |
| 0.8784722222222222 | 0 |
| 0.8791666666666668 | 0 |
| 0.8798611111111111 | 0 |
| 0.8805555555555555 | 0 |
| 0.88125 | 0 |
| 0.8819444444444445 | 0 |
| 0.8826388888888889 | 0 |
| 0.8833333333333333 | 0 |
| 0.8840277777777777 | 0 |
| 0.8847222222222223 | 0 |
| 0.8854166666666666 | 0 |
| 0.8861111111111111 | 0 |
| 0.8868055555555556 | 0 |
| 0.8875000000000001 | 0 |
| 0.8881944444444444 | 0 |
| 0.8888888888888888 | 0 |
| 0.8895833333333334 | 0 |
| 0.8902777777777778 | 0 |
| 0.8909722222222222 | 0 |
| 0.8916666666666666 | 0 |
| 0.8923611111111112 | 0 |
| 0.8930555555555556 | 0 |
| 0.8937499999999999 | 0 |
| 0.8944444444444444 | 0 |
| 0.8951388888888889 | 0 |
| 0.8958333333333334 | 0 |
| 0.8965277777777777 | 0 |
| 0.8972222222222223 | 0 |
| 0.8979166666666667 | 0 |
| 0.8986111111111111 | 0 |
| 0.8993055555555555 | 0 |
| 0.9 | 0 |
| 0.9006944444444445 | 0 |
| 0.9013888888888889 | 0 |
| 0.9020833333333332 | 0 |
| 0.9027777777777778 | 0 |
| 0.9034722222222222 | 0 |
| 0.9041666666666667 | 0 |
| 0.904861111111111 | 0 |
| 0.9055555555555556 | 0 |
| 0.90625 | 0 |
| 0.9069444444444444 | 0 |
| 0.907638888888889 | 0 |
| 0.9083333333333333 | 0 |
| 0.9090277777777778 | 0 |
| 0.9097222222222222 | 0 |
| 0.9104166666666668 | 0 |
| 0.9111111111111111 | 0 |
| 0.9118055555555555 | 0 |
| 0.9125 | 0 |
| 0.9131944444444445 | 0 |
| 0.9138888888888889 | 0 |
| 0.9145833333333333 | 0 |
| 0.9152777777777777 | 0 |
| 0.9159722222222223 | 0 |
| 0.9166666666666666 | 0 |
| 0.9173611111111111 | 0 |
| 0.9180555555555556 | 0 |
| 0.9187500000000001 | 0 |
| 0.9194444444444444 | 0 |
| 0.9201388888888888 | 0 |
| 0.9208333333333334 | 0 |
| 0.9215277777777778 | 0 |
| 0.9222222222222222 | 0 |
| 0.9229166666666666 | 0 |
| 0.9236111111111112 | 0 |
| 0.9243055555555556 | 0 |
| 0.9249999999999999 | 0 |
| 0.9256944444444444 | 0 |
| 0.9263888888888889 | 0 |
| 0.9270833333333334 | 0 |
| 0.9277777777777777 | 0 |
| 0.9284722222222223 | 0 |
| 0.9291666666666667 | 0 |
| 0.9298611111111111 | 0 |
| 0.9305555555555555 | 0 |
| 0.93125 | 0 |
| 0.9319444444444445 | 0 |
| 0.9326388888888889 | 0 |
| 0.9333333333333332 | 0 |
| 0.9340277777777778 | 0 |
| 0.9347222222222222 | 0 |
| 0.9354166666666667 | 0 |
| 0.936111111111111 | 0 |
| 0.9368055555555556 | 0 |
| 0.9375 | 0 |
| 0.9381944444444444 | 0 |
| 0.938888888888889 | 0 |
| 0.9395833333333333 | 0 |
| 0.9402777777777778 | 0 |
| 0.9409722222222222 | 0 |
| 0.9416666666666668 | 0 |
| 0.9423611111111111 | 0 |
| 0.9430555555555555 | 0 |
| 0.94375 | 0 |
| 0.9444444444444445 | 0 |
| 0.9451388888888889 | 0 |
| 0.9458333333333333 | 0 |
| 0.9465277777777777 | 0 |
| 0.9472222222222223 | 0 |
| 0.9479166666666666 | 0 |
| 0.9486111111111111 | 0 |
| 0.9493055555555556 | 0 |
| 0.9500000000000001 | 0 |
| 0.9506944444444444 | 0 |
| 0.9513888888888888 | 0 |
| 0.9520833333333334 | 0 |
| 0.9527777777777778 | 0 |
| 0.9534722222222222 | 0 |
| 0.9541666666666666 | 0 |
| 0.9548611111111112 | 0 |
| 0.9555555555555556 | 0 |
| 0.9562499999999999 | 0 |
| 0.9569444444444444 | 0 |
| 0.9576388888888889 | 0 |
| 0.9583333333333334 | 0 |
| 0.9590277777777777 | 0 |
| 0.9597222222222223 | 0 |
| 0.9604166666666667 | 0 |
| 0.9611111111111111 | 0 |
| 0.9618055555555555 | 0 |
| 0.9625 | 0 |
| 0.9631944444444445 | 0 |
| 0.9638888888888889 | 0 |
| 0.9645833333333332 | 0 |
| 0.9652777777777778 | 0 |
| 0.9659722222222222 | 0 |
| 0.9666666666666667 | 0 |
| 0.967361111111111 | 0 |
| 0.9680555555555556 | 0 |
| 0.96875 | 0 |
| 0.9694444444444444 | 0 |
| 0.970138888888889 | 0 |
| 0.9708333333333333 | 0 |
| 0.9715277777777778 | 0 |
| 0.9722222222222222 | 0 |
| 0.9729166666666668 | 0 |
| 0.9736111111111111 | 0 |
| 0.9743055555555555 | 0 |
| 0.975 | 0 |
| 0.9756944444444445 | 0 |
| 0.9763888888888889 | 0 |
| 0.9770833333333333 | 0 |
| 0.9777777777777777 | 0 |
| 0.9784722222222223 | 0 |
| 0.9791666666666666 | 0 |
| 0.9798611111111111 | 0 |
| 0.9805555555555556 | 0 |
| 0.9812500000000001 | 0 |
| 0.9819444444444444 | 0 |
| 0.9826388888888888 | 0 |
| 0.9833333333333334 | 0 |
| 0.9840277777777778 | 0 |
| 0.9847222222222222 | 0 |
| 0.9854166666666666 | 0 |
| 0.9861111111111112 | 0 |
| 0.9868055555555556 | 0 |
| 0.9874999999999999 | 0 |
| 0.9881944444444444 | 0 |
| 0.9888888888888889 | 0 |
| 0.9895833333333334 | 0 |
| 0.9902777777777777 | 0 |
| 0.9909722222222223 | 0 |
| 0.9916666666666667 | 0 |
| 0.9923611111111111 | 0 |
| 0.9930555555555555 | 0 |
| 0.99375 | 0 |
| 0.9944444444444445 | 0 |
| 0.9951388888888889 | 0 |
| 0.9958333333333332 | 0 |
| 0.9965277777777778 | 0 |
| 0.9972222222222222 | 0 |
| 0.9979166666666667 | 0 |
| 0.998611111111111 | 0 |
| 0.9993055555555556 | 0 |